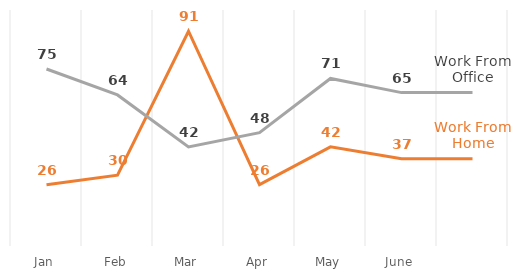
| Category | Series 1 | Series 2 |
|---|---|---|
| Jan | 26 | 75 |
| Feb | 30 | 64 |
| Mar | 91 | 42 |
| Apr | 26 | 48 |
| May | 42 | 71 |
| June | 37 | 65 |